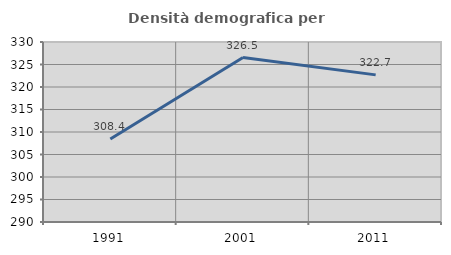
| Category | Densità demografica |
|---|---|
| 1991.0 | 308.433 |
| 2001.0 | 326.541 |
| 2011.0 | 322.692 |